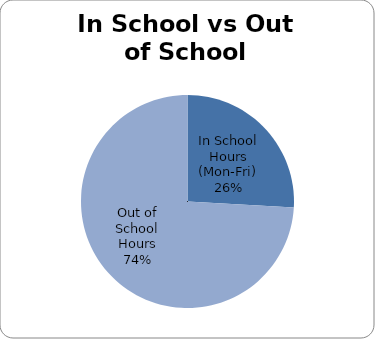
| Category | Series 0 |
|---|---|
| In School Hours (Mon-Fri) | 2340 |
| Out of School Hours | 6693 |